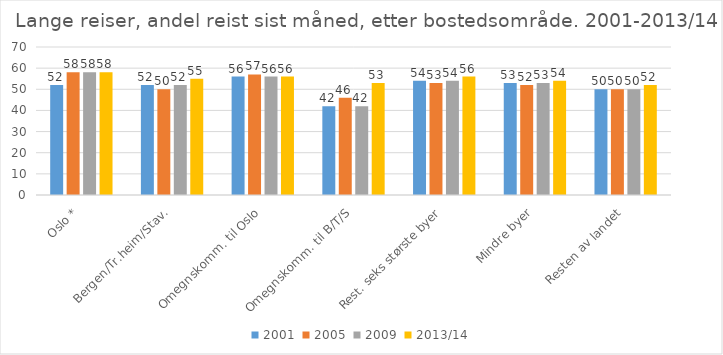
| Category | 2001 | 2005 | 2009 | 2013/14 |
|---|---|---|---|---|
| Oslo * | 52 | 58 | 58 | 58 |
| Bergen/Tr.heim/Stav. | 52 | 50 | 52 | 55 |
| Omegnskomm. til Oslo | 56 | 57 | 56 | 56 |
| Omegnskomm. til B/T/S | 42 | 46 | 42 | 53 |
| Rest. seks største byer | 54 | 53 | 54 | 56 |
| Mindre byer | 53 | 52 | 53 | 54 |
| Resten av landet | 50 | 50 | 50 | 52 |